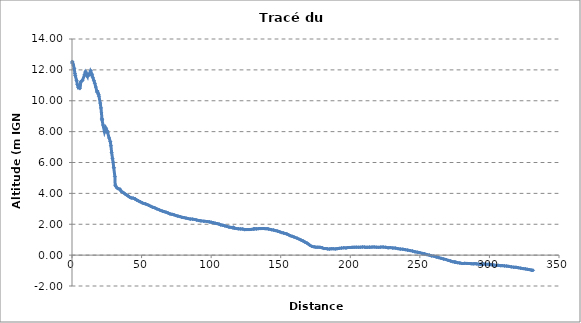
| Category | Series 0 |
|---|---|
| 0.0 | 12.446 |
| 0.21146394503543756 | 12.545 |
| 0.9596770289778789 | 12.308 |
| 1.5905813400747497 | 12.092 |
| 2.122323491234676 | 11.766 |
| 2.320759573656162 | 11.638 |
| 3.3092399432261415 | 11.309 |
| 3.869922609016478 | 11.046 |
| 4.515879205357626 | 10.855 |
| 5.25608723300045 | 10.891 |
| 5.548619378103715 | 10.786 |
| 6.376134644300524 | 11.228 |
| 6.862495172914573 | 11.289 |
| 7.487420717147979 | 11.314 |
| 9.057511468545666 | 11.691 |
| 9.63071762610649 | 11.836 |
| 9.789311926533209 | 11.899 |
| 10.455652825130306 | 11.677 |
| 11.089463332509734 | 11.573 |
| 11.377000395137262 | 11.717 |
| 11.39238921364104 | 11.735 |
| 12.471794938707196 | 11.69 |
| 12.889071727668314 | 11.686 |
| 13.285516362138727 | 11.919 |
| 13.512983423383002 | 11.95 |
| 14.366330254878928 | 11.717 |
| 14.970625704800732 | 11.504 |
| 15.757462517541466 | 11.303 |
| 16.381490835305883 | 11.134 |
| 17.094987569021615 | 10.89 |
| 18.035229995496977 | 10.556 |
| 18.166047120851953 | 10.642 |
| 19.110718719646673 | 10.406 |
| 19.389724288602242 | 10.291 |
| 20.29039765483097 | 9.849 |
| 20.80599050782876 | 9.534 |
| 21.178803176380125 | 9.211 |
| 21.505934459633636 | 8.855 |
| 21.59476475888301 | 8.771 |
| 21.612403961902256 | 8.755 |
| 22.291991924850837 | 8.429 |
| 23.364460469012666 | 7.989 |
| 23.67006653960419 | 7.986 |
| 24.241093456820586 | 8.235 |
| 24.422545833733153 | 8.22 |
| 25.172138963173655 | 8.056 |
| 25.648466816001005 | 7.928 |
| 26.674494934074335 | 7.589 |
| 27.512155658770727 | 7.355 |
| 27.646842929919963 | 7.327 |
| 27.97494180498857 | 7.086 |
| 28.508506186888624 | 6.634 |
| 29.1300447131748 | 6.251 |
| 29.54109341251565 | 6.012 |
| 29.948948695851517 | 5.699 |
| 30.183903591054946 | 5.651 |
| 30.81117759838743 | 5.094 |
| 31.053835351216172 | 4.535 |
| 31.431811274023545 | 4.471 |
| 32.2138440427019 | 4.362 |
| 33.306903263421496 | 4.299 |
| 34.44181484757364 | 4.273 |
| 35.53041043965866 | 4.12 |
| 36.82594738729816 | 4.058 |
| 37.94696099836147 | 3.973 |
| 39.13585938757147 | 3.906 |
| 40.26861023172785 | 3.837 |
| 41.332814917540176 | 3.761 |
| 42.59739655200483 | 3.704 |
| 43.8738996671433 | 3.695 |
| 45.30403004158176 | 3.643 |
| 45.31391155023253 | 3.647 |
| 46.5042406879105 | 3.565 |
| 47.762745000858715 | 3.511 |
| 49.014475188436926 | 3.458 |
| 50.28098210055157 | 3.397 |
| 51.44056030969373 | 3.345 |
| 52.848975477478454 | 3.319 |
| 54.14227484102081 | 3.274 |
| 55.3009876946305 | 3.221 |
| 56.59499045852876 | 3.16 |
| 57.93297918250697 | 3.104 |
| 59.411684650258806 | 3.069 |
| 60.801063682899894 | 3.003 |
| 62.23192075604595 | 2.955 |
| 63.62360970591974 | 2.891 |
| 65.06165568160561 | 2.847 |
| 66.3968533139467 | 2.816 |
| 67.68801327429635 | 2.776 |
| 69.10856894028349 | 2.727 |
| 70.48774022442926 | 2.668 |
| 71.90351403085066 | 2.643 |
| 73.28181576620038 | 2.616 |
| 74.68201626182406 | 2.562 |
| 76.09638262735861 | 2.528 |
| 77.53632175957198 | 2.498 |
| 78.96534216983879 | 2.45 |
| 80.486516050733 | 2.43 |
| 81.94784121646995 | 2.399 |
| 83.49744966133915 | 2.369 |
| 85.02388645548102 | 2.335 |
| 86.59549320817061 | 2.331 |
| 88.1110889839079 | 2.309 |
| 89.6274811930525 | 2.273 |
| 91.16564697288005 | 2.239 |
| 92.6128486979506 | 2.22 |
| 94.77339146570787 | 2.195 |
| 97.29762131239758 | 2.178 |
| 98.70153825043612 | 2.155 |
| 100.0496676658334 | 2.13 |
| 101.46752522871772 | 2.103 |
| 102.89067335775917 | 2.067 |
| 104.27183075449781 | 2.042 |
| 105.67709277291416 | 2.011 |
| 106.97638930631695 | 1.956 |
| 108.46781783111321 | 1.934 |
| 109.83502609383353 | 1.897 |
| 111.32157667772009 | 1.856 |
| 112.87559563476397 | 1.815 |
| 114.52007733540181 | 1.794 |
| 115.75227539020561 | 1.762 |
| 115.9117554909215 | 1.809 |
| 116.83869528996682 | 1.747 |
| 118.33389852441547 | 1.72 |
| 119.76487355613527 | 1.703 |
| 121.24778866824691 | 1.697 |
| 122.71942129128156 | 1.691 |
| 124.15139255780606 | 1.651 |
| 125.68851646059821 | 1.655 |
| 127.27599375405455 | 1.656 |
| 128.8461969476047 | 1.664 |
| 130.37326969115608 | 1.693 |
| 130.85636981849288 | 1.699 |
| 131.3932534071772 | 1.705 |
| 132.55670448859823 | 1.698 |
| 133.97626578642 | 1.716 |
| 135.5537113946307 | 1.718 |
| 137.0783837736618 | 1.722 |
| 138.64756226496152 | 1.716 |
| 140.14476686641927 | 1.713 |
| 141.34402190714388 | 1.688 |
| 143.4202330633195 | 1.644 |
| 144.88393853333093 | 1.623 |
| 146.39027238541834 | 1.588 |
| 147.75598786163434 | 1.554 |
| 149.22809516987166 | 1.516 |
| 150.65686180822112 | 1.459 |
| 152.0444209103458 | 1.431 |
| 153.37838399180922 | 1.396 |
| 154.43458104996068 | 1.368 |
| 155.64763839510331 | 1.317 |
| 156.8362497539182 | 1.26 |
| 158.16245655601497 | 1.22 |
| 159.5487393900935 | 1.174 |
| 161.72877599831318 | 1.099 |
| 163.59591404704628 | 1.018 |
| 164.7988534548949 | 0.965 |
| 166.10840774955773 | 0.916 |
| 167.4995498289709 | 0.839 |
| 168.92076216082228 | 0.778 |
| 170.0787855581026 | 0.699 |
| 170.6052040854366 | 0.659 |
| 172.49477687472742 | 0.561 |
| 174.00969456305467 | 0.537 |
| 175.30832080955724 | 0.513 |
| 176.732078203218 | 0.515 |
| 178.21680659492225 | 0.508 |
| 179.74048133088897 | 0.479 |
| 181.0807852646951 | 0.426 |
| 182.3794385919513 | 0.427 |
| 183.62958107008822 | 0.406 |
| 184.9519811324686 | 0.392 |
| 186.29321051729892 | 0.413 |
| 187.68595630204823 | 0.414 |
| 189.18422718821122 | 0.4 |
| 190.4956378212908 | 0.417 |
| 191.9961600575904 | 0.438 |
| 193.6846772795526 | 0.459 |
| 195.31500679628766 | 0.475 |
| 196.93917940854632 | 0.466 |
| 198.44476718926367 | 0.493 |
| 199.8028791706024 | 0.495 |
| 201.27268384219502 | 0.504 |
| 202.74112966316903 | 0.508 |
| 204.27977576066502 | 0.514 |
| 205.88446157220818 | 0.509 |
| 207.3417653486404 | 0.511 |
| 208.81756713692488 | 0.527 |
| 210.21806861463935 | 0.52 |
| 211.25592428132737 | 0.504 |
| 212.2712885808924 | 0.506 |
| 213.66980194879963 | 0.511 |
| 213.99278803943812 | 0.513 |
| 215.60544448104545 | 0.52 |
| 217.16164934414738 | 0.524 |
| 218.77726570186638 | 0.513 |
| 220.32529028638984 | 0.502 |
| 221.89257606780205 | 0.518 |
| 223.6240262802071 | 0.521 |
| 225.37723033178196 | 0.508 |
| 227.1783819376662 | 0.477 |
| 228.7985324161867 | 0.489 |
| 230.5879937313332 | 0.461 |
| 232.31463207036754 | 0.456 |
| 234.15098809104228 | 0.421 |
| 235.9462550032259 | 0.393 |
| 237.7463262891759 | 0.383 |
| 239.49032174994815 | 0.354 |
| 241.24631018325735 | 0.323 |
| 243.02738196503935 | 0.294 |
| 244.7454154934519 | 0.262 |
| 246.4948982697499 | 0.217 |
| 248.21047836900217 | 0.189 |
| 249.84745777591883 | 0.162 |
| 251.6326938573143 | 0.113 |
| 253.36397044550313 | 0.088 |
| 255.0850148185097 | 0.031 |
| 256.71367279484394 | 0.004 |
| 258.4152245919219 | -0.049 |
| 260.08604356642 | -0.065 |
| 261.83529432434574 | -0.12 |
| 263.6079659267281 | -0.162 |
| 265.38181681864603 | -0.21 |
| 267.1425747612856 | -0.252 |
| 268.82644905943454 | -0.286 |
| 270.50467166593035 | -0.344 |
| 272.0977285092465 | -0.381 |
| 273.64260166312323 | -0.425 |
| 274.8616215694982 | -0.444 |
| 275.3527143297619 | -0.459 |
| 275.80979887245076 | -0.456 |
| 277.110380629706 | -0.489 |
| 278.7284969733878 | -0.508 |
| 280.44601962231343 | -0.544 |
| 282.15928458229763 | -0.533 |
| 283.85470767404456 | -0.537 |
| 285.42183905571295 | -0.543 |
| 286.84717259181656 | -0.553 |
| 288.29481217110714 | -0.566 |
| 289.59258749638036 | -0.552 |
| 290.92761524660517 | -0.568 |
| 292.1969796777427 | -0.584 |
| 293.2091345673303 | -0.593 |
| 293.7133020410727 | -0.603 |
| 294.37547437249606 | -0.581 |
| 295.7540409800181 | -0.577 |
| 297.4749738801928 | -0.588 |
| 299.3222091076027 | -0.59 |
| 301.26409386153415 | -0.621 |
| 303.08408661600635 | -0.641 |
| 304.7882731096506 | -0.667 |
| 306.36758085811994 | -0.662 |
| 308.0525503546839 | -0.682 |
| 309.2443256083364 | -0.679 |
| 310.8071404407581 | -0.698 |
| 312.4444490780085 | -0.709 |
| 314.0616091946306 | -0.731 |
| 315.78057645465555 | -0.758 |
| 317.4984649407588 | -0.784 |
| 319.1171125351056 | -0.789 |
| 320.7552347884016 | -0.815 |
| 322.4410825558303 | -0.847 |
| 324.14050850210924 | -0.872 |
| 325.7797448737004 | -0.889 |
| 327.30005436165646 | -0.92 |
| 328.69847660247575 | -0.935 |
| 330.07750416033036 | -0.972 |
| 330.94560977423754 | -0.99 |
| 331.2724203431083 | -0.979 |